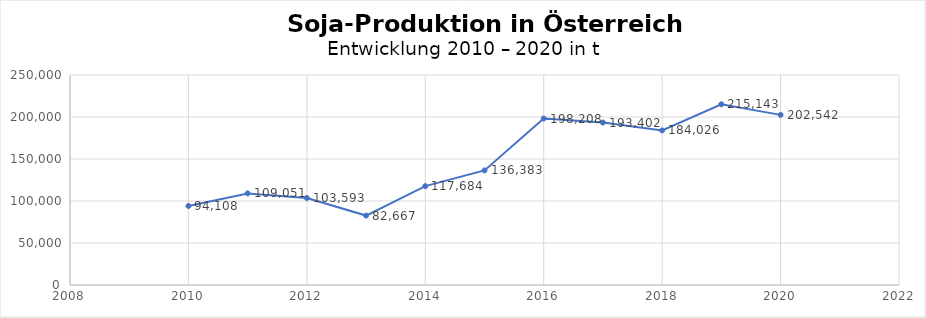
| Category | Series 0 |
|---|---|
| 2010.0 | 94108 |
| 2011.0 | 109051 |
| 2012.0 | 103593 |
| 2013.0 | 82667 |
| 2014.0 | 117684 |
| 2015.0 | 136383 |
| 2016.0 | 198208 |
| 2017.0 | 193402 |
| 2018.0 | 184026 |
| 2019.0 | 215143 |
| 2020.0 | 202542 |